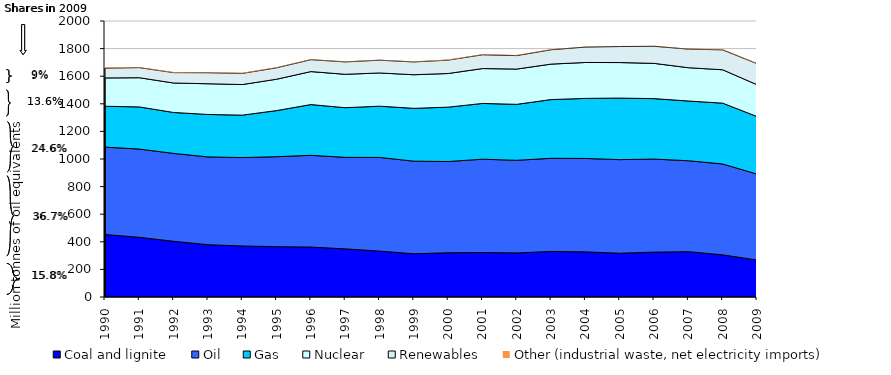
| Category | Coal and lignite | Oil | Gas | Nuclear | Renewables | Other (industrial waste, net electricity imports) |
|---|---|---|---|---|---|---|
| 1990.0 | 453.314 | 632.934 | 295.934 | 205.205 | 70.696 | 5.089 |
| 1991.0 | 432.378 | 639.633 | 305.417 | 211.54 | 73.114 | 3.124 |
| 1992.0 | 403.788 | 636.774 | 296.559 | 213.494 | 75.24 | 3.937 |
| 1993.0 | 379.013 | 635.949 | 307.831 | 222.483 | 79.737 | 3.925 |
| 1994.0 | 369.727 | 640.58 | 307.586 | 221.591 | 80.76 | 4.002 |
| 1995.0 | 364.709 | 651.91 | 334.141 | 227.301 | 82.881 | 4.538 |
| 1996.0 | 361.953 | 664.783 | 367.692 | 238.954 | 86.363 | 2.642 |
| 1997.0 | 348.908 | 663.016 | 359.84 | 241.966 | 89.954 | 3.129 |
| 1998.0 | 332.951 | 678.408 | 371.403 | 240.716 | 92.5 | 2.825 |
| 1999.0 | 313.136 | 671.223 | 382.794 | 243.431 | 92.758 | 3.677 |
| 2000.0 | 320.782 | 660.972 | 393.935 | 243.841 | 96.944 | 4.627 |
| 2001.0 | 322.548 | 676.012 | 404.047 | 252.665 | 99.892 | 4.084 |
| 2002.0 | 319.616 | 670.898 | 405.588 | 255.556 | 97.65 | 4.671 |
| 2003.0 | 330.056 | 674.951 | 425.587 | 257.017 | 103.856 | 3.213 |
| 2004.0 | 327.095 | 676.825 | 435.232 | 260.286 | 111.506 | 2.611 |
| 2005.0 | 317.26 | 678.13 | 446.023 | 257.516 | 116.035 | 2.945 |
| 2006.0 | 325.258 | 674.173 | 438.095 | 255.499 | 123.834 | 2.308 |
| 2007.0 | 328.618 | 658.866 | 432.599 | 241.41 | 134.512 | 3.333 |
| 2008.0 | 305.395 | 658.487 | 440.834 | 241.909 | 144.237 | 3.622 |
| 2009.0 | 267.914 | 622.858 | 416.792 | 230.767 | 152.597 | 4.714 |